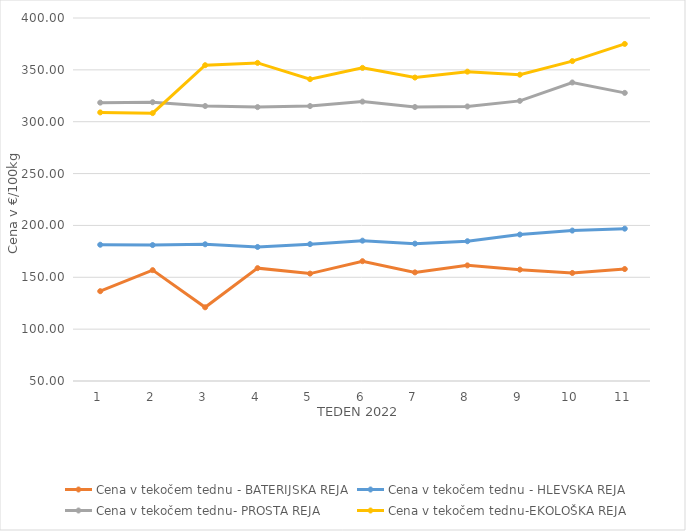
| Category | Cena v tekočem tednu - BATERIJSKA REJA | Cena v tekočem tednu - HLEVSKA REJA | Cena v tekočem tednu- PROSTA REJA | Cena v tekočem tednu-EKOLOŠKA REJA |
|---|---|---|---|---|
| 1.0 | 136.59 | 181.38 | 318.4 | 308.97 |
| 2.0 | 156.88 | 181.07 | 318.82 | 308.28 |
| 3.0 | 121.07 | 181.83 | 315.14 | 354.48 |
| 4.0 | 158.82 | 179.22 | 314.08 | 356.72 |
| 5.0 | 153.55 | 181.96 | 315.1 | 341.03 |
| 6.0 | 165.51 | 185.31 | 319.38 | 351.9 |
| 7.0 | 154.74 | 182.45 | 314.16 | 342.59 |
| 8.0 | 161.48 | 184.77 | 314.71 | 348.28 |
| 9.0 | 157.38 | 191.21 | 320.1 | 345.35 |
| 10.0 | 154.16 | 195.04 | 337.83 | 358.45 |
| 11.0 | 157.96 | 196.88 | 327.79 | 375 |